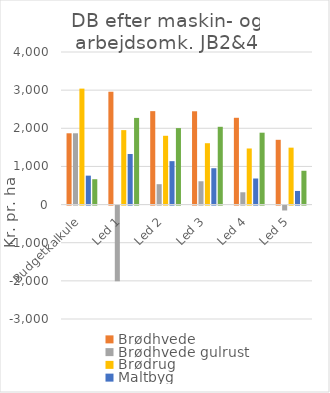
| Category | Brødhvede | Brødhvede gulrust | Brødrug | Maltbyg | Grynhavre |
|---|---|---|---|---|---|
| Budgetkalkule | 1869 | 1869 | 3040 | 758.5 | 664.5 |
| Led 1 | 2958 | -1985 | 1951.862 | 1326.222 | 2272.225 |
| Led 2 | 2449.3 | 534.8 | 1803.4 | 1138.383 | 2005.025 |
| Led 3 | 2446.05 | 611.05 | 1608.477 | 953.163 | 2038.975 |
| Led 4 | 2275.4 | 322.4 | 1470.477 | 683.394 | 1884.475 |
| Led 5 | 1698 | -128.5 | 1492.185 | 357.383 | 886.125 |